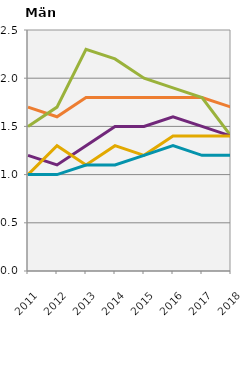
| Category | Yrkesexamensprogram totalt | Förskollärarexamen                                 | Grundlärarexamen                                   | Yrkeslärarexamen                                   | Ämneslärarexamen                                   |
|---|---|---|---|---|---|
| 2011.0 | 1.7 | 1.5 | 1.2 | 1 | 1 |
| 2012.0 | 1.6 | 1.7 | 1.1 | 1.3 | 1 |
| 2013.0 | 1.8 | 2.3 | 1.3 | 1.1 | 1.1 |
| 2014.0 | 1.8 | 2.2 | 1.5 | 1.3 | 1.1 |
| 2015.0 | 1.8 | 2 | 1.5 | 1.2 | 1.2 |
| 2016.0 | 1.8 | 1.9 | 1.6 | 1.4 | 1.3 |
| 2017.0 | 1.8 | 1.8 | 1.5 | 1.4 | 1.2 |
| 2018.0 | 1.7 | 1.4 | 1.4 | 1.4 | 1.2 |